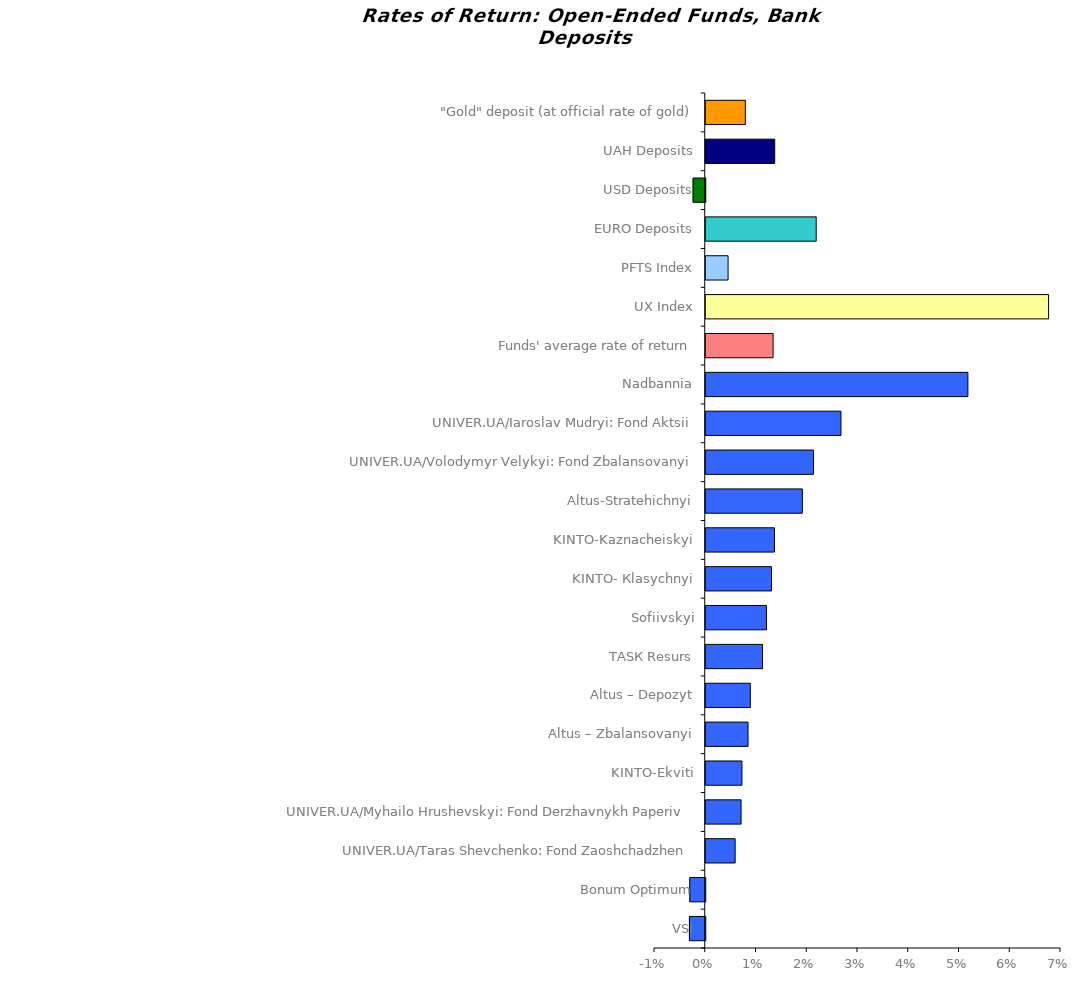
| Category | Series 0 |
|---|---|
| VSI | -0.003 |
| Bonum Optimum | -0.003 |
| UNIVER.UA/Taras Shevchenko: Fond Zaoshchadzhen | 0.006 |
| UNIVER.UA/Myhailo Hrushevskyi: Fond Derzhavnykh Paperiv    | 0.007 |
| KINTO-Ekviti | 0.007 |
| Altus – Zbalansovanyi | 0.008 |
| Altus – Depozyt | 0.009 |
| ТАSК Resurs | 0.011 |
| Sofiivskyi | 0.012 |
| KINTO- Кlasychnyi | 0.013 |
| KINTO-Kaznacheiskyi | 0.014 |
| Altus-Stratehichnyi | 0.019 |
| UNIVER.UA/Volodymyr Velykyi: Fond Zbalansovanyi | 0.021 |
| UNIVER.UA/Iaroslav Mudryi: Fond Aktsii | 0.027 |
| Nadbannia | 0.052 |
| Funds' average rate of return | 0.013 |
| UX Index | 0.068 |
| PFTS Index | 0.004 |
| EURO Deposits | 0.022 |
| USD Deposits | -0.002 |
| UAH Deposits | 0.014 |
| "Gold" deposit (at official rate of gold) | 0.008 |